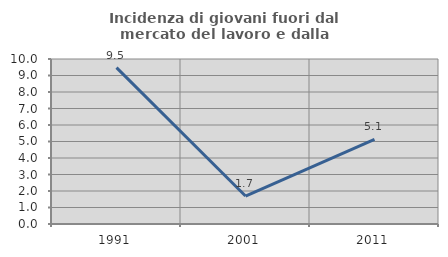
| Category | Incidenza di giovani fuori dal mercato del lavoro e dalla formazione  |
|---|---|
| 1991.0 | 9.474 |
| 2001.0 | 1.695 |
| 2011.0 | 5.128 |